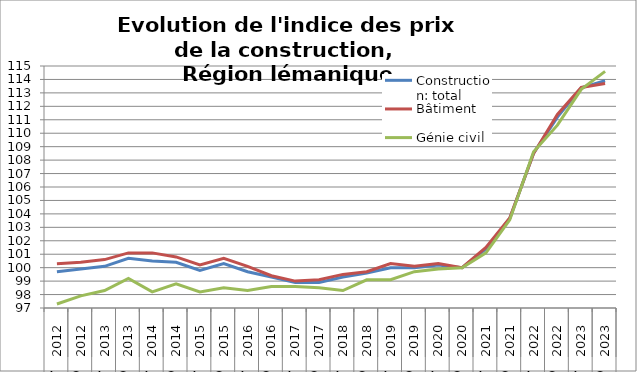
| Category | Construction: total | Bâtiment | Génie civil |
|---|---|---|---|
| 0 | 99.7 | 100.3 | 97.3 |
| 1 | 99.9 | 100.4 | 97.9 |
| 2 | 100.1 | 100.6 | 98.3 |
| 3 | 100.7 | 101.1 | 99.2 |
| 4 | 100.5 | 101.1 | 98.2 |
| 5 | 100.4 | 100.8 | 98.8 |
| 6 | 99.8 | 100.2 | 98.2 |
| 7 | 100.3 | 100.7 | 98.5 |
| 8 | 99.7 | 100.1 | 98.3 |
| 9 | 99.3 | 99.4 | 98.6 |
| 10 | 98.9 | 99 | 98.6 |
| 11 | 98.9 | 99.1 | 98.5 |
| 12 | 99.3 | 99.5 | 98.3 |
| 13 | 99.6 | 99.7 | 99.1 |
| 14 | 100 | 100.3 | 99.1 |
| 15 | 100 | 100.1 | 99.7 |
| 16 | 100.2 | 100.3 | 99.9 |
| 17 | 100 | 100 | 100 |
| 18 | 101.4 | 101.5 | 101.1 |
| 19 | 103.663 | 103.694 | 103.554 |
| 20 | 108.515 | 108.486 | 108.616 |
| 21 | 111.2 | 111.4 | 110.6 |
| 22 | 113.37 | 113.401 | 113.267 |
| 23 | 113.9 | 113.7 | 114.6 |